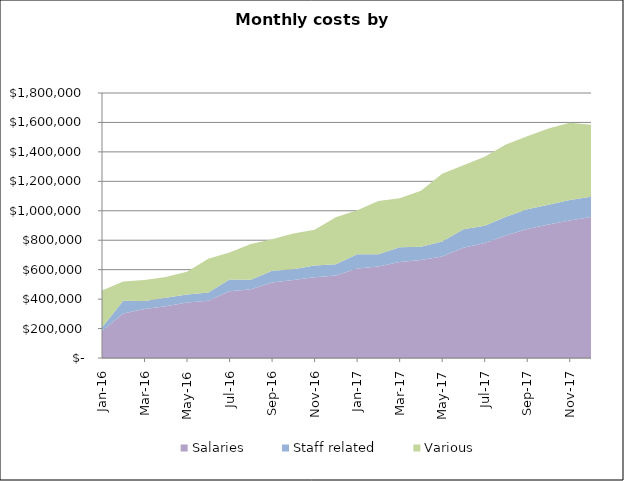
| Category | Salaries | Staff related | Various |
|---|---|---|---|
| Jan-16 | 182600 | 24750 | 251369.25 |
| Feb-16 | 301800 | 87250 | 130015.146 |
| Mar-16 | 333000 | 54000 | 142878.325 |
| Apr-16 | 352200 | 56250 | 140901.594 |
| May-16 | 376800 | 54250 | 154087.285 |
| Jun-16 | 388800 | 56250 | 228944.672 |
| Jul-16 | 453000 | 79750 | 183013.641 |
| Aug-16 | 466200 | 65250 | 242342.544 |
| Sep-16 | 512400 | 81000 | 213378.969 |
| Oct-16 | 530400 | 72000 | 243732.952 |
| Nov-16 | 548400 | 79750 | 242821.798 |
| Dec-16 | 559800 | 77250 | 319235.823 |
| Jan-17 | 607200 | 97750 | 298057.025 |
| Feb-17 | 621600 | 83750 | 361687.005 |
| Mar-17 | 652200 | 100000 | 333728.597 |
| Apr-17 | 665400 | 89500 | 381119.718 |
| May-17 | 690000 | 102000 | 458843.401 |
| Jun-17 | 748400 | 126000 | 434535.151 |
| Jul-17 | 780800 | 117750 | 468716.609 |
| Aug-17 | 832400 | 127750 | 489864.741 |
| Sep-17 | 875800 | 133750 | 496530.911 |
| Oct-17 | 907000 | 134000 | 517844.954 |
| Nov-17 | 934600 | 139250 | 524264.63 |
| Dec-17 | 957400 | 138250 | 488858.902 |